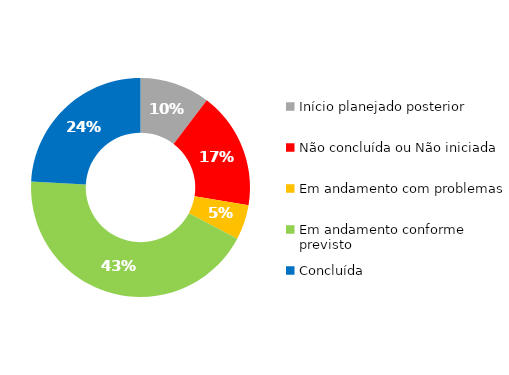
| Category | Series 0 |
|---|---|
| Início planejado posterior | 6 |
| Não concluída ou Não iniciada | 10 |
| Em andamento com problemas | 3 |
| Em andamento conforme previsto | 25 |
| Concluída | 14 |